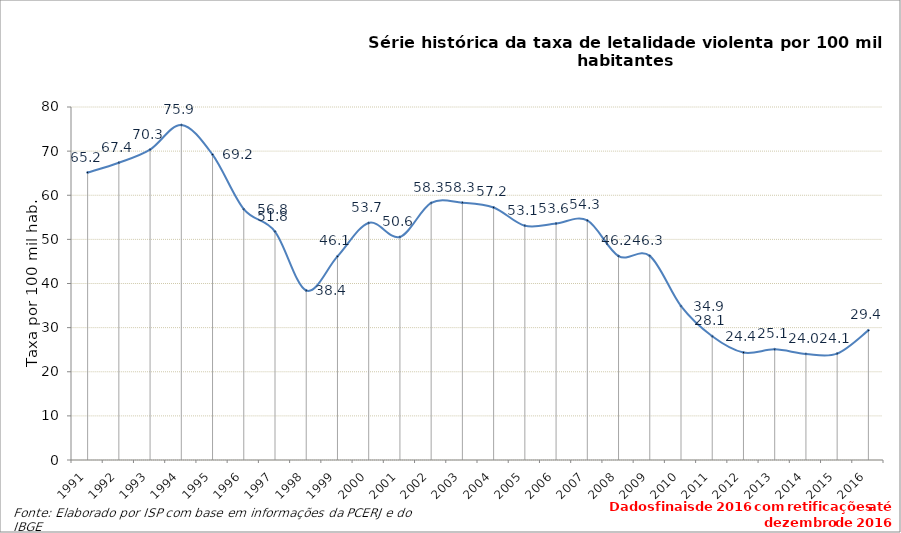
| Category | Series 0 |
|---|---|
| 1991.0 | 65.155 |
| 1992.0 | 67.378 |
| 1993.0 | 70.343 |
| 1994.0 | 75.922 |
| 1995.0 | 69.208 |
| 1996.0 | 56.849 |
| 1997.0 | 51.773 |
| 1998.0 | 38.418 |
| 1999.0 | 46.141 |
| 2000.0 | 53.722 |
| 2001.0 | 50.554 |
| 2002.0 | 58.259 |
| 2003.0 | 58.318 |
| 2004.0 | 57.231 |
| 2005.0 | 53.1 |
| 2006.0 | 53.595 |
| 2007.0 | 54.29 |
| 2008.0 | 46.216 |
| 2009.0 | 46.265 |
| 2010.0 | 34.887 |
| 2011.0 | 28.052 |
| 2012.0 | 24.365 |
| 2013.0 | 25.086 |
| 2014.0 | 24.048 |
| 2015.0 | 24.117 |
| 2016.0 | 29.374 |